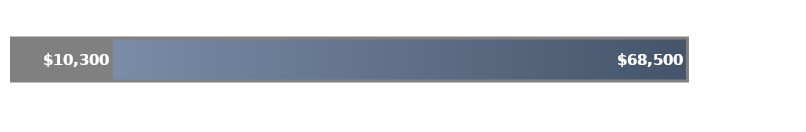
| Category | TOTAL FUNDING | TOTAL EXPENSES |
|---|---|---|
| 0 | 68500 | 10300 |